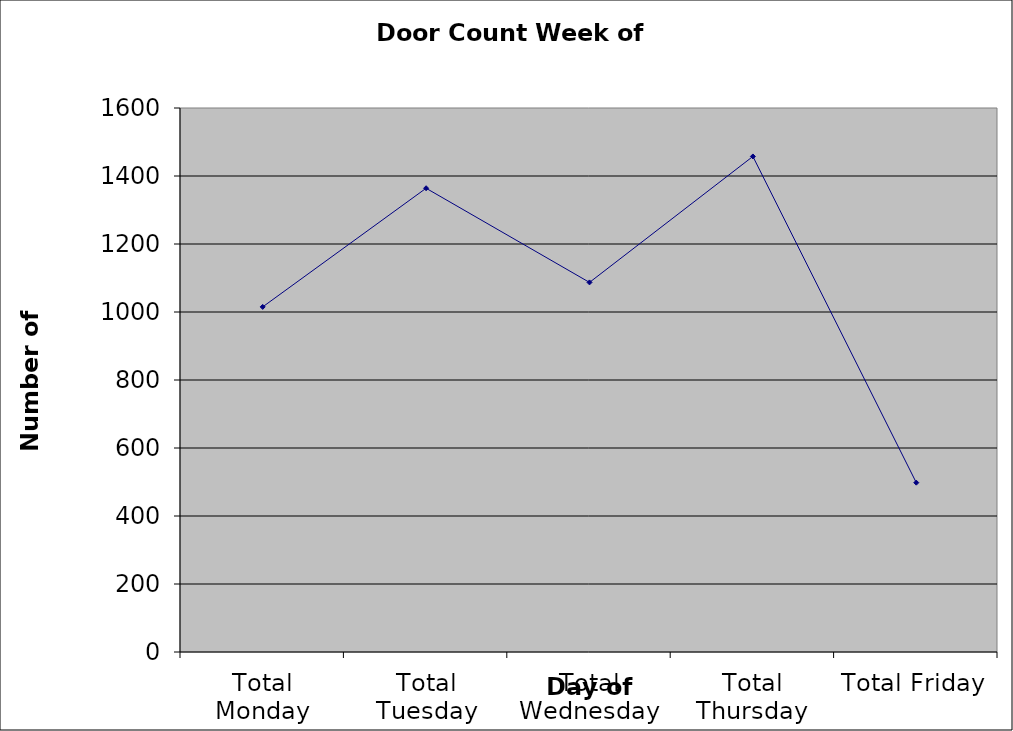
| Category | Series 0 |
|---|---|
| Total Monday | 1015 |
| Total Tuesday | 1364 |
| Total Wednesday | 1087 |
| Total Thursday | 1457.5 |
| Total Friday | 498 |